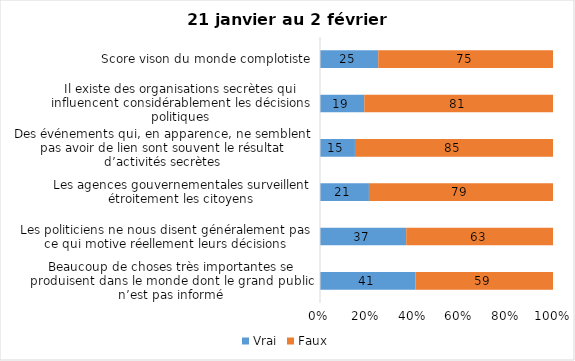
| Category | Vrai | Faux |
|---|---|---|
| Beaucoup de choses très importantes se produisent dans le monde dont le grand public n’est pas informé | 41 | 59 |
| Les politiciens ne nous disent généralement pas ce qui motive réellement leurs décisions | 37 | 63 |
| Les agences gouvernementales surveillent étroitement les citoyens | 21 | 79 |
| Des événements qui, en apparence, ne semblent pas avoir de lien sont souvent le résultat d’activités secrètes | 15 | 85 |
| Il existe des organisations secrètes qui influencent considérablement les décisions politiques | 19 | 81 |
| Score vison du monde complotiste | 25 | 75 |